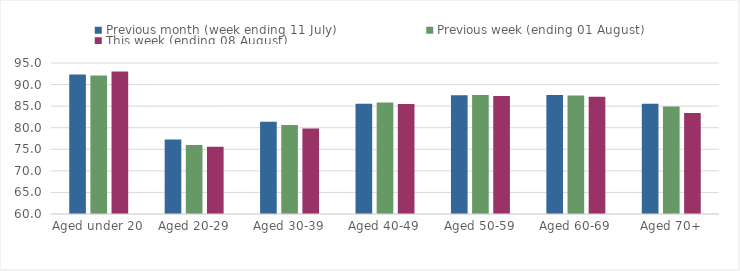
| Category | Previous month (week ending 11 July) | Previous week (ending 01 August) | This week (ending 08 August) |
|---|---|---|---|
| Aged under 20 | 92.31 | 92.109 | 93.019 |
| Aged 20-29 | 77.276 | 75.97 | 75.573 |
| Aged 30-39 | 81.411 | 80.621 | 79.811 |
| Aged 40-49 | 85.554 | 85.873 | 85.517 |
| Aged 50-59 | 87.544 | 87.568 | 87.374 |
| Aged 60-69 | 87.58 | 87.441 | 87.199 |
| Aged 70+ | 85.54 | 84.892 | 83.392 |